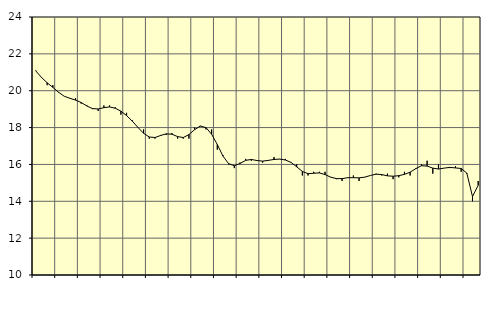
| Category | Piggar | Tillverkning o utvinning, energi o miljö, SNI 05-33, 35-39 |
|---|---|---|
| nan | 21.1 | 21.07 |
| 1.0 | 20.7 | 20.72 |
| 1.0 | 20.3 | 20.43 |
| 1.0 | 20.3 | 20.18 |
| nan | 19.9 | 19.92 |
| 2.0 | 19.7 | 19.7 |
| 2.0 | 19.6 | 19.59 |
| 2.0 | 19.6 | 19.49 |
| nan | 19.3 | 19.36 |
| 3.0 | 19.2 | 19.17 |
| 3.0 | 19 | 19.03 |
| 3.0 | 18.9 | 19.01 |
| nan | 19.2 | 19.08 |
| 4.0 | 19.2 | 19.12 |
| 4.0 | 19.1 | 19.05 |
| 4.0 | 18.7 | 18.89 |
| nan | 18.8 | 18.65 |
| 5.0 | 18.4 | 18.35 |
| 5.0 | 18 | 18.01 |
| 5.0 | 17.9 | 17.69 |
| nan | 17.4 | 17.49 |
| 6.0 | 17.4 | 17.46 |
| 6.0 | 17.6 | 17.57 |
| 6.0 | 17.6 | 17.66 |
| nan | 17.7 | 17.64 |
| 7.0 | 17.4 | 17.51 |
| 7.0 | 17.4 | 17.46 |
| 7.0 | 17.4 | 17.62 |
| nan | 18 | 17.89 |
| 8.0 | 18.1 | 18.08 |
| 8.0 | 17.9 | 18 |
| 8.0 | 17.9 | 17.64 |
| nan | 16.8 | 17.08 |
| 9.0 | 16.5 | 16.45 |
| 9.0 | 16 | 16.04 |
| 9.0 | 15.8 | 15.93 |
| nan | 16.1 | 16.05 |
| 10.0 | 16.3 | 16.22 |
| 10.0 | 16.2 | 16.27 |
| 10.0 | 16.2 | 16.21 |
| nan | 16.1 | 16.18 |
| 11.0 | 16.2 | 16.22 |
| 11.0 | 16.4 | 16.27 |
| 11.0 | 16.3 | 16.29 |
| nan | 16.3 | 16.24 |
| 12.0 | 16.1 | 16.11 |
| 12.0 | 16 | 15.87 |
| 12.0 | 15.4 | 15.62 |
| nan | 15.4 | 15.5 |
| 13.0 | 15.6 | 15.52 |
| 13.0 | 15.6 | 15.54 |
| 13.0 | 15.6 | 15.45 |
| nan | 15.3 | 15.31 |
| 14.0 | 15.2 | 15.23 |
| 14.0 | 15.1 | 15.23 |
| 14.0 | 15.3 | 15.28 |
| nan | 15.4 | 15.28 |
| 15.0 | 15.1 | 15.27 |
| 15.0 | 15.3 | 15.31 |
| 15.0 | 15.4 | 15.4 |
| nan | 15.5 | 15.47 |
| 16.0 | 15.4 | 15.45 |
| 16.0 | 15.5 | 15.38 |
| 16.0 | 15.2 | 15.36 |
| nan | 15.3 | 15.39 |
| 17.0 | 15.6 | 15.46 |
| 17.0 | 15.4 | 15.58 |
| 17.0 | 15.8 | 15.77 |
| nan | 16 | 15.93 |
| 18.0 | 16.2 | 15.91 |
| 18.0 | 15.5 | 15.8 |
| 18.0 | 16 | 15.75 |
| nan | 15.8 | 15.8 |
| 19.0 | 15.8 | 15.84 |
| 19.0 | 15.9 | 15.81 |
| 19.0 | 15.6 | 15.78 |
| nan | 15.5 | 15.53 |
| 20.0 | 14 | 14.26 |
| 20.0 | 15.1 | 14.86 |